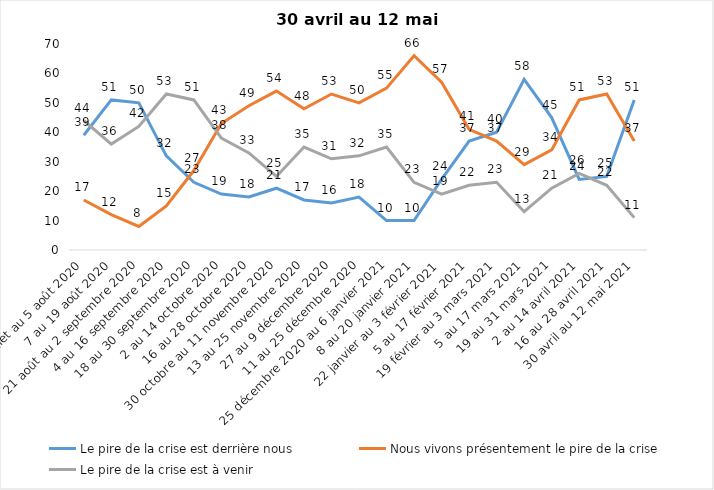
| Category | Le pire de la crise est derrière nous | Nous vivons présentement le pire de la crise | Le pire de la crise est à venir |
|---|---|---|---|
| 24 juillet au 5 août 2020 | 39 | 17 | 44 |
| 7 au 19 août 2020 | 51 | 12 | 36 |
| 21 août au 2 septembre 2020 | 50 | 8 | 42 |
| 4 au 16 septembre 2020 | 32 | 15 | 53 |
| 18 au 30 septembre 2020 | 23 | 27 | 51 |
| 2 au 14 octobre 2020 | 19 | 43 | 38 |
| 16 au 28 octobre 2020 | 18 | 49 | 33 |
| 30 octobre au 11 novembre 2020 | 21 | 54 | 25 |
| 13 au 25 novembre 2020 | 17 | 48 | 35 |
| 27 au 9 décembre 2020 | 16 | 53 | 31 |
| 11 au 25 décembre 2020 | 18 | 50 | 32 |
| 25 décembre 2020 au 6 janvier 2021 | 10 | 55 | 35 |
| 8 au 20 janvier 2021 | 10 | 66 | 23 |
| 22 janvier au 3 février 2021 | 24 | 57 | 19 |
| 5 au 17 février 2021 | 37 | 41 | 22 |
| 19 février au 3 mars 2021 | 40 | 37 | 23 |
| 5 au 17 mars 2021 | 58 | 29 | 13 |
| 19 au 31 mars 2021 | 45 | 34 | 21 |
| 2 au 14 avril 2021 | 24 | 51 | 26 |
| 16 au 28 avril 2021 | 25 | 53 | 22 |
| 30 avril au 12 mai 2021 | 51 | 37 | 11 |